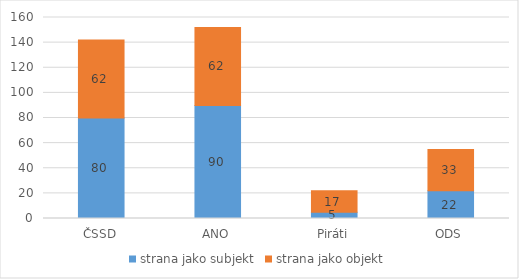
| Category | strana jako subjekt | strana jako objekt |
|---|---|---|
| ČSSD | 80 | 62 |
| ANO | 90 | 62 |
| Piráti | 5 | 17 |
| ODS | 22 | 33 |